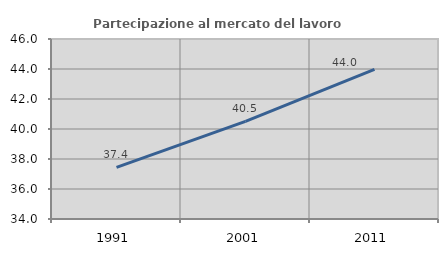
| Category | Partecipazione al mercato del lavoro  femminile |
|---|---|
| 1991.0 | 37.44 |
| 2001.0 | 40.512 |
| 2011.0 | 43.981 |